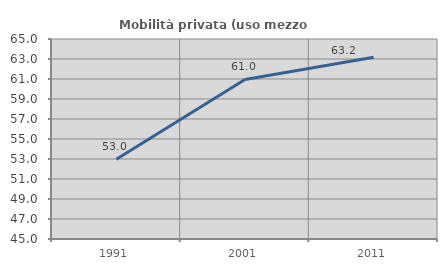
| Category | Mobilità privata (uso mezzo privato) |
|---|---|
| 1991.0 | 52.976 |
| 2001.0 | 60.953 |
| 2011.0 | 63.175 |